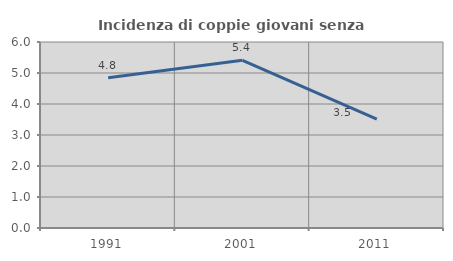
| Category | Incidenza di coppie giovani senza figli |
|---|---|
| 1991.0 | 4.848 |
| 2001.0 | 5.409 |
| 2011.0 | 3.509 |